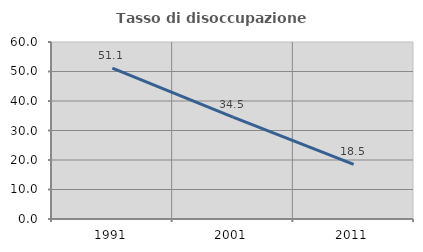
| Category | Tasso di disoccupazione giovanile  |
|---|---|
| 1991.0 | 51.111 |
| 2001.0 | 34.545 |
| 2011.0 | 18.519 |